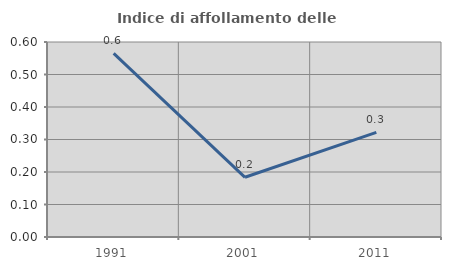
| Category | Indice di affollamento delle abitazioni  |
|---|---|
| 1991.0 | 0.565 |
| 2001.0 | 0.184 |
| 2011.0 | 0.322 |